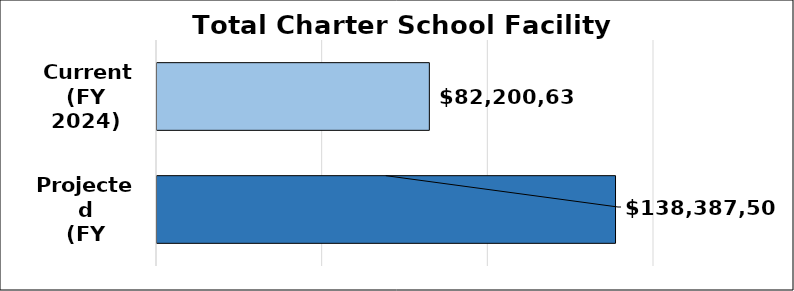
| Category | Total facility gap |
|---|---|
|  Current
(FY 2024) | 82200632.047 |
| Projected
(FY 2029) | 138387505.528 |